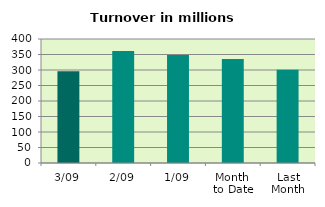
| Category | Series 0 |
|---|---|
| 3/09 | 296.078 |
| 2/09 | 361.688 |
| 1/09 | 348.253 |
| Month 
to Date | 335.34 |
| Last
Month | 300.77 |